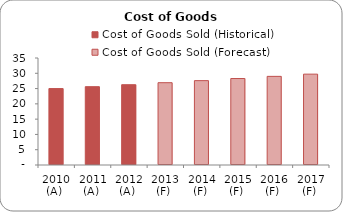
| Category | Cost of Goods Sold (Historical) | Cost of Goods Sold (Forecast) |
|---|---|---|
| 2010 (A)  | 25 | 0 |
| 2011 (A)  | 25.625 | 0 |
| 2012 (A)  | 26.266 | 0 |
| 2013 (F)  | 0 | 26.922 |
| 2014 (F)  | 0 | 27.595 |
| 2015 (F)  | 0 | 28.285 |
| 2016 (F)  | 0 | 28.992 |
| 2017 (F)  | 0 | 29.717 |